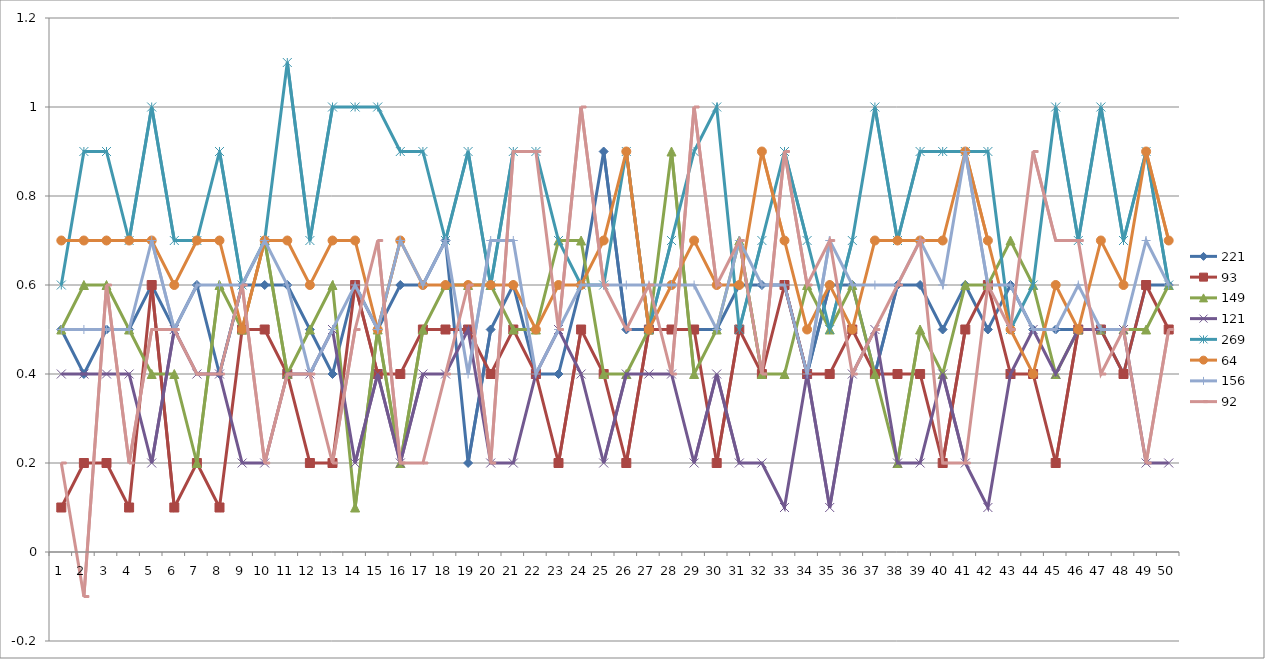
| Category | 221 | 93 | 149 | 121 | 269 | 64 | 156 | 92 |
|---|---|---|---|---|---|---|---|---|
| 0 | 0.5 | 0.1 | 0.5 | 0.4 | 0.6 | 0.7 | 0.5 | 0.2 |
| 1 | 0.4 | 0.2 | 0.6 | 0.4 | 0.9 | 0.7 | 0.5 | -0.1 |
| 2 | 0.5 | 0.2 | 0.6 | 0.4 | 0.9 | 0.7 | 0.5 | 0.6 |
| 3 | 0.5 | 0.1 | 0.5 | 0.4 | 0.7 | 0.7 | 0.5 | 0.2 |
| 4 | 0.6 | 0.6 | 0.4 | 0.2 | 1 | 0.7 | 0.7 | 0.5 |
| 5 | 0.5 | 0.1 | 0.4 | 0.5 | 0.7 | 0.6 | 0.5 | 0.5 |
| 6 | 0.6 | 0.2 | 0.2 | 0.4 | 0.7 | 0.7 | 0.6 | 0.4 |
| 7 | 0.4 | 0.1 | 0.6 | 0.4 | 0.9 | 0.7 | 0.6 | 0.4 |
| 8 | 0.6 | 0.5 | 0.5 | 0.2 | 0.6 | 0.5 | 0.6 | 0.6 |
| 9 | 0.6 | 0.5 | 0.7 | 0.2 | 0.7 | 0.7 | 0.7 | 0.2 |
| 10 | 0.6 | 0.4 | 0.4 | 0.4 | 1.1 | 0.7 | 0.6 | 0.4 |
| 11 | 0.5 | 0.2 | 0.5 | 0.4 | 0.7 | 0.6 | 0.4 | 0.4 |
| 12 | 0.4 | 0.2 | 0.6 | 0.5 | 1 | 0.7 | 0.5 | 0.2 |
| 13 | 0.6 | 0.6 | 0.1 | 0.2 | 1 | 0.7 | 0.6 | 0.5 |
| 14 | 0.5 | 0.4 | 0.5 | 0.4 | 1 | 0.5 | 0.5 | 0.7 |
| 15 | 0.6 | 0.4 | 0.2 | 0.2 | 0.9 | 0.7 | 0.7 | 0.2 |
| 16 | 0.6 | 0.5 | 0.5 | 0.4 | 0.9 | 0.6 | 0.6 | 0.2 |
| 17 | 0.7 | 0.5 | 0.6 | 0.4 | 0.7 | 0.6 | 0.7 | 0.4 |
| 18 | 0.2 | 0.5 | 0.6 | 0.5 | 0.9 | 0.6 | 0.4 | 0.6 |
| 19 | 0.5 | 0.4 | 0.6 | 0.2 | 0.6 | 0.6 | 0.7 | 0.2 |
| 20 | 0.6 | 0.5 | 0.5 | 0.2 | 0.9 | 0.6 | 0.7 | 0.9 |
| 21 | 0.4 | 0.4 | 0.5 | 0.4 | 0.9 | 0.5 | 0.4 | 0.9 |
| 22 | 0.4 | 0.2 | 0.7 | 0.5 | 0.7 | 0.6 | 0.5 | 0.5 |
| 23 | 0.6 | 0.5 | 0.7 | 0.4 | 0.6 | 0.6 | 0.6 | 1 |
| 24 | 0.9 | 0.4 | 0.4 | 0.2 | 0.6 | 0.7 | 0.6 | 0.6 |
| 25 | 0.5 | 0.2 | 0.4 | 0.4 | 0.9 | 0.9 | 0.6 | 0.5 |
| 26 | 0.5 | 0.5 | 0.5 | 0.4 | 0.5 | 0.5 | 0.6 | 0.6 |
| 27 | 0.5 | 0.5 | 0.9 | 0.4 | 0.7 | 0.6 | 0.6 | 0.4 |
| 28 | 0.5 | 0.5 | 0.4 | 0.2 | 0.9 | 0.7 | 0.6 | 1 |
| 29 | 0.5 | 0.2 | 0.5 | 0.4 | 1 | 0.6 | 0.5 | 0.6 |
| 30 | 0.6 | 0.5 | 0.7 | 0.2 | 0.5 | 0.6 | 0.7 | 0.7 |
| 31 | 0.6 | 0.4 | 0.4 | 0.2 | 0.7 | 0.9 | 0.6 | 0.4 |
| 32 | 0.6 | 0.6 | 0.4 | 0.1 | 0.9 | 0.7 | 0.6 | 0.9 |
| 33 | 0.4 | 0.4 | 0.6 | 0.4 | 0.7 | 0.5 | 0.4 | 0.6 |
| 34 | 0.6 | 0.4 | 0.5 | 0.1 | 0.5 | 0.6 | 0.7 | 0.7 |
| 35 | 0.6 | 0.5 | 0.6 | 0.4 | 0.7 | 0.5 | 0.6 | 0.4 |
| 36 | 0.4 | 0.4 | 0.4 | 0.5 | 1 | 0.7 | 0.6 | 0.5 |
| 37 | 0.6 | 0.4 | 0.2 | 0.2 | 0.7 | 0.7 | 0.6 | 0.6 |
| 38 | 0.6 | 0.4 | 0.5 | 0.2 | 0.9 | 0.7 | 0.7 | 0.7 |
| 39 | 0.5 | 0.2 | 0.4 | 0.4 | 0.9 | 0.7 | 0.6 | 0.2 |
| 40 | 0.6 | 0.5 | 0.6 | 0.2 | 0.9 | 0.9 | 0.9 | 0.2 |
| 41 | 0.5 | 0.6 | 0.6 | 0.1 | 0.9 | 0.7 | 0.6 | 0.6 |
| 42 | 0.6 | 0.4 | 0.7 | 0.4 | 0.5 | 0.5 | 0.6 | 0.5 |
| 43 | 0.5 | 0.4 | 0.6 | 0.5 | 0.6 | 0.4 | 0.5 | 0.9 |
| 44 | 0.5 | 0.2 | 0.4 | 0.4 | 1 | 0.6 | 0.5 | 0.7 |
| 45 | 0.5 | 0.5 | 0.5 | 0.5 | 0.7 | 0.5 | 0.6 | 0.7 |
| 46 | 0.5 | 0.5 | 0.5 | 0.5 | 1 | 0.7 | 0.5 | 0.4 |
| 47 | 0.4 | 0.4 | 0.5 | 0.5 | 0.7 | 0.6 | 0.5 | 0.5 |
| 48 | 0.6 | 0.6 | 0.5 | 0.2 | 0.9 | 0.9 | 0.7 | 0.2 |
| 49 | 0.6 | 0.5 | 0.6 | 0.2 | 0.6 | 0.7 | 0.6 | 0.5 |